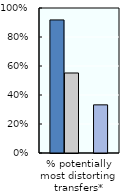
| Category | EU28 (1986-88) | EU28 (2000-02) | Series 2 | UK (2018-20) |
|---|---|---|---|---|
| % potentially most distorting transfers* | 0.918 | 0.552 |  | 0.332 |